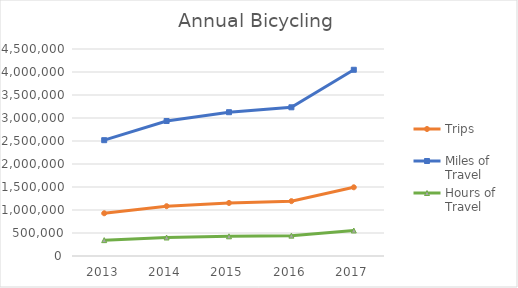
| Category | Trips | Miles of Travel | Hours of Travel |
|---|---|---|---|
| 2013 | 928918.864 | 2517834.581 | 344770.249 |
| 2014 | 1082845.149 | 2935051.777 | 401900.323 |
| 2015 | 1153243.306 | 3125865.982 | 428028.752 |
| 2016 | 1192541.68 | 3232384.224 | 442614.428 |
| 2017 | 1493551.209 | 4048270.551 | 554334.767 |